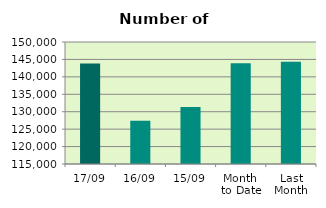
| Category | Series 0 |
|---|---|
| 17/09 | 143826 |
| 16/09 | 127418 |
| 15/09 | 131326 |
| Month 
to Date | 143905.077 |
| Last
Month | 144368.095 |